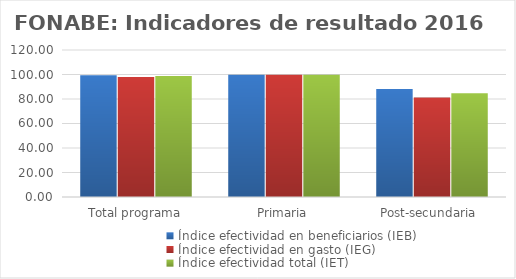
| Category | Índice efectividad en beneficiarios (IEB) | Índice efectividad en gasto (IEG)  | Índice efectividad total (IET) |
|---|---|---|---|
| Total programa | 99.471 | 97.941 | 98.706 |
| Primaria | 99.734 | 99.734 | 99.734 |
| Post-secundaria  | 88.165 | 81.182 | 84.673 |